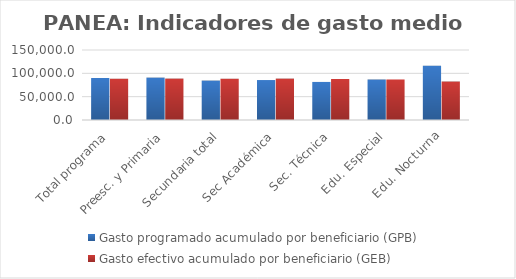
| Category | Gasto programado acumulado por beneficiario (GPB)  | Gasto efectivo acumulado por beneficiario (GEB)  |
|---|---|---|
| Total programa | 89953.726 | 88410.043 |
| Preesc. y Primaria | 90820.157 | 88717.101 |
| Secundaria total | 84457.894 | 88403.05 |
| Sec Académica | 85623.226 | 88693.308 |
| Sec. Técnica | 81566.071 | 87806.685 |
| Edu. Especial | 86752.619 | 86835.283 |
| Edu. Nocturna | 116400.211 | 82452.584 |